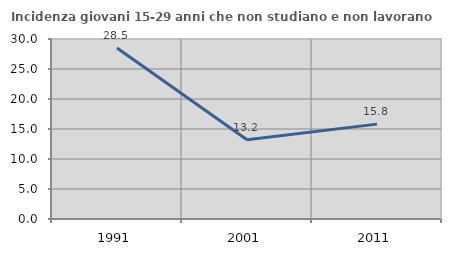
| Category | Incidenza giovani 15-29 anni che non studiano e non lavorano  |
|---|---|
| 1991.0 | 28.512 |
| 2001.0 | 13.216 |
| 2011.0 | 15.812 |